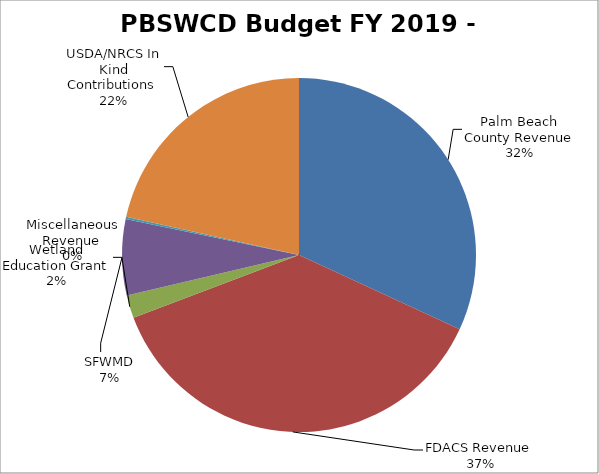
| Category | Series 0 |
|---|---|
| Palm Beach County Revenue | 137951 |
| FDACS Revenue  | 161490 |
| Wetland Education Grant | 9000 |
| SFWMD | 30000 |
| Miscellaneous Revenue  | 875 |
| USDA/NRCS In Kind Contributions  | 93159 |